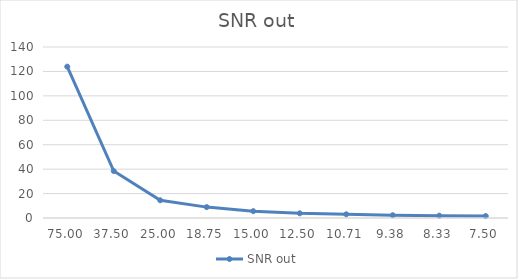
| Category | SNR out |
|---|---|
| 75.0 | 123.92 |
| 37.5 | 38.46 |
| 25.0 | 14.49 |
| 18.75 | 8.91 |
| 15.0 | 5.59 |
| 12.5 | 3.84 |
| 10.714285714285715 | 3.03 |
| 9.375 | 2.28 |
| 8.333333333333334 | 1.91 |
| 7.5 | 1.61 |